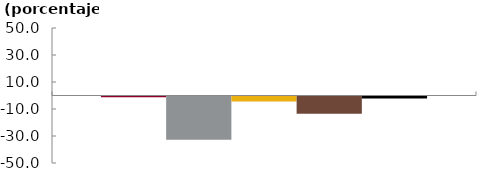
| Category | Bancos | CF | CFC | Coop | Sistema |
|---|---|---|---|---|---|
|  | -0.492 | -32.122 | -3.688 | -12.814 | -1.473 |